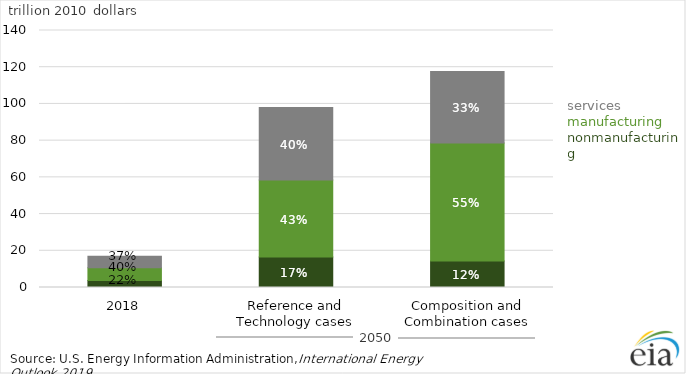
| Category | Nonmanufacturing | Manufacturing | Services |
|---|---|---|---|
| 2018 | 3826.582 | 6876.555 | 6326.006 |
| Reference and Technology cases | 16629.16 | 41868.7 | 39496 |
| Composition and Combination cases | 14386.77 | 64350.5 | 38938.93 |